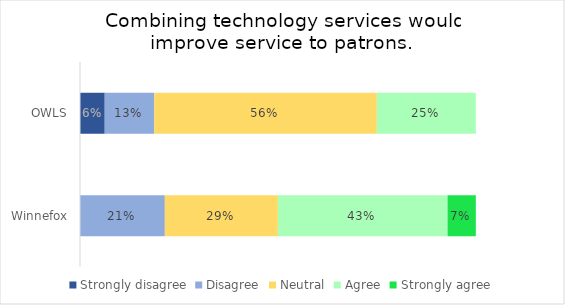
| Category | Strongly disagree | Disagree | Neutral | Agree | Strongly agree |
|---|---|---|---|---|---|
| OWLS | 0.062 | 0.125 | 0.562 | 0.25 | 0 |
| Winnefox | 0 | 0.214 | 0.286 | 0.429 | 0.071 |